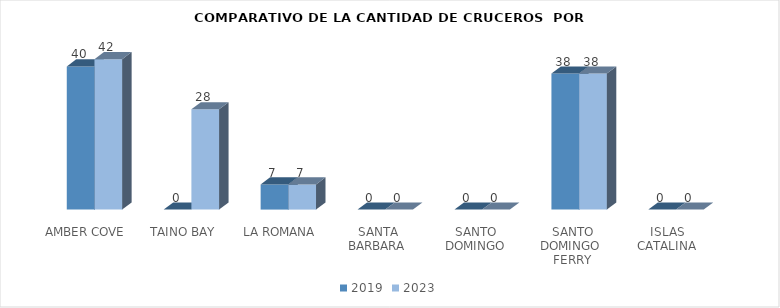
| Category | 2019 | 2023 |
|---|---|---|
| AMBER COVE | 40 | 42 |
| TAINO BAY | 0 | 28 |
| LA ROMANA | 7 | 7 |
| SANTA BARBARA  | 0 | 0 |
| SANTO DOMINGO | 0 | 0 |
| SANTO DOMINGO  FERRY | 38 | 38 |
| ISLAS  CATALINA  | 0 | 0 |